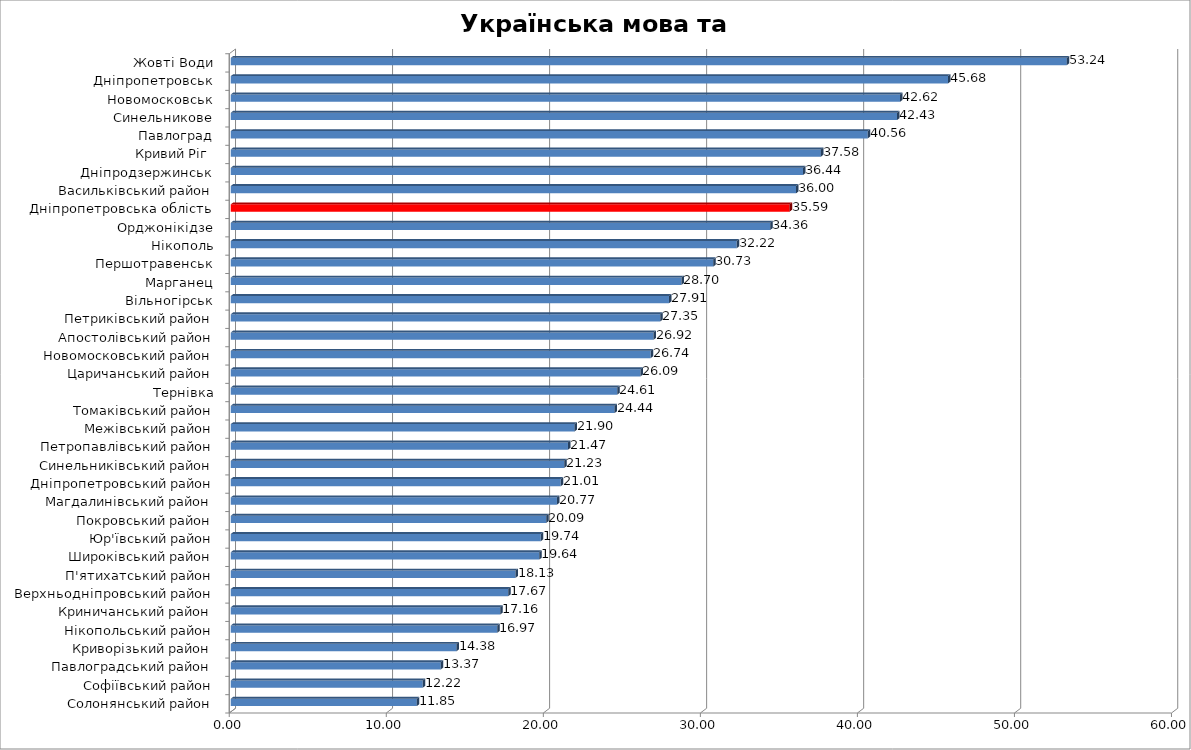
| Category | [160;200] |
|---|---|
| Солонянський район | 11.848 |
| Софіївський район | 12.225 |
| Павлоградський район | 13.375 |
| Криворізький район | 14.383 |
| Нікопольський район | 16.968 |
| Криничанський район | 17.159 |
| Верхньодніпровський район | 17.672 |
| П'ятихатський район | 18.133 |
| Широківський район | 19.642 |
| Юр'ївський район | 19.738 |
| Покровський район | 20.09 |
| Магдалинівський район | 20.773 |
| Дніпропетровський район | 21.01 |
| Синельниківський район | 21.233 |
| Петропавлівський район | 21.474 |
| Межівський район | 21.897 |
| Томаківський район | 24.444 |
| Тернівка | 24.606 |
| Царичанський район | 26.09 |
| Новомосковський район | 26.74 |
| Апостолівський район | 26.922 |
| Петриківський район | 27.346 |
| Вільногірськ | 27.906 |
| Марганец | 28.702 |
| Першотравенськ | 30.73 |
| Нікополь | 32.219 |
| Орджонікідзе | 34.357 |
| Дніпропетровська облість | 35.589 |
| Васильківський район | 36 |
| Дніпродзержинськ | 36.44 |
| Кривий Ріг  | 37.579 |
| Павлоград | 40.564 |
| Синельникове | 42.427 |
| Новомосковськ | 42.625 |
| Дніпропетровськ | 45.675 |
| Жовті Води | 53.241 |